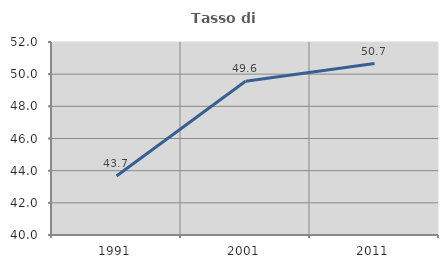
| Category | Tasso di occupazione   |
|---|---|
| 1991.0 | 43.669 |
| 2001.0 | 49.558 |
| 2011.0 | 50.658 |